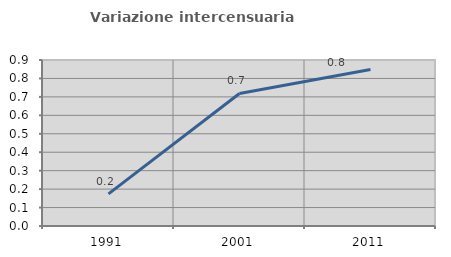
| Category | Variazione intercensuaria annua |
|---|---|
| 1991.0 | 0.174 |
| 2001.0 | 0.718 |
| 2011.0 | 0.848 |